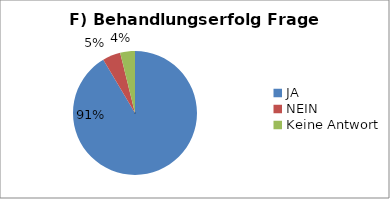
| Category | Series 0 |
|---|---|
| JA | 214 |
| NEIN | 11 |
| Keine Antwort | 9 |